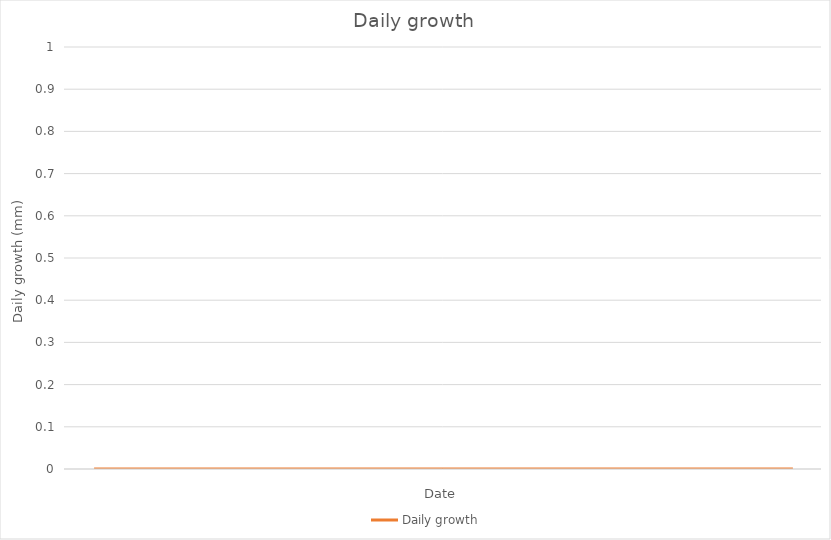
| Category | Daily growth |
|---|---|
|  | 0 |
|  | 0 |
|  | 0 |
|  | 0 |
|  | 0 |
|  | 0 |
|  | 0 |
|  | 0 |
|  | 0 |
|  | 0 |
|  | 0 |
|  | 0 |
|  | 0 |